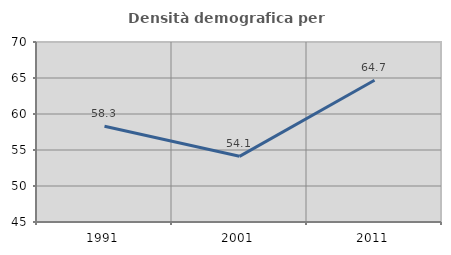
| Category | Densità demografica |
|---|---|
| 1991.0 | 58.304 |
| 2001.0 | 54.12 |
| 2011.0 | 64.683 |